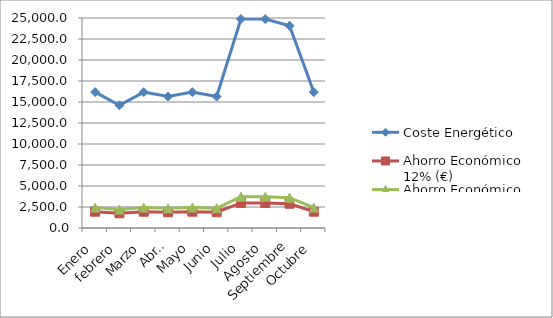
| Category | Coste Energético | Ahorro Económico 12% (€) | Ahorro Económico 15% (€) |
|---|---|---|---|
| Enero | 16173.63 | 1940.836 | 2426.044 |
| febrero | 14608.44 | 1753.013 | 2191.266 |
| Marzo | 16173.63 | 1940.836 | 2426.044 |
| Abril | 15651.9 | 1878.228 | 2347.785 |
| Mayo | 16173.63 | 1940.836 | 2426.044 |
| Junio | 15651.9 | 1878.228 | 2347.785 |
| Julio | 24875.454 | 2985.054 | 3731.318 |
| Agosto | 24875.454 | 2985.054 | 3731.318 |
| Septiembre | 24073.02 | 2888.762 | 3610.953 |
| Octubre | 16173.63 | 1940.836 | 2426.044 |